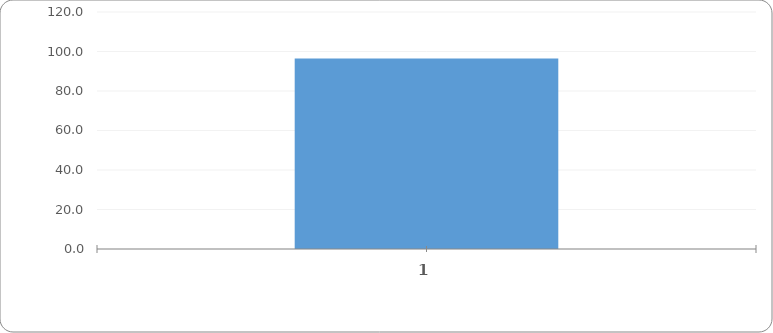
| Category | Series 0 |
|---|---|
| 0 | 96.468 |